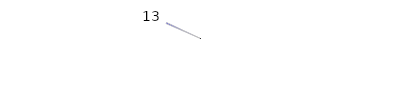
| Category | Series 0 |
|---|---|
| nan | 13 |
| 13.0 | 1 |
| 1.0 | 186 |